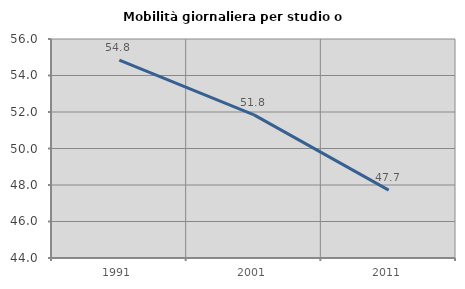
| Category | Mobilità giornaliera per studio o lavoro |
|---|---|
| 1991.0 | 54.843 |
| 2001.0 | 51.84 |
| 2011.0 | 47.72 |